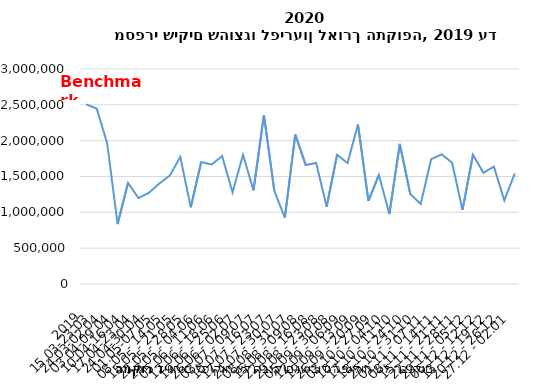
| Category | שקים שהוצגו |
|---|---|
| 2019 | 2505602.018 |
| 15.03-23.03 | 2447764.747 |
| 24.03-02.04 | 1969691.752 |
| 03.04-09.04 | 835909.958 |
| 10.04-16.04 | 1410844.055 |
| 17.04-23.04 | 1199728.1 |
| 24.04-30.04 | 1272102.004 |
| 01.05-07.05 | 1403450.125 |
| 08.05 - 14.05 | 1513602.584 |
| 15.05 - 21.05 | 1774359.916 |
| 22.05 - 28.05 | 1070139.033 |
| 29.05 - 04.06 | 1701196.476 |
| 05.06 - 11.06 | 1667047.789 |
| 12.06 - 18.06 | 1784783.333 |
| 19.06 - 25.06 | 1278883.621 |
| 26.06 - 02.07 | 1804113 |
| 03.07 - 09.07 | 1304956.889 |
| 10.07 - 16.07 | 2355105.692 |
| 17.07 - 23.07 | 1299211.824 |
| 24.07 - 30.07 | 927653.211 |
| 08.08 - 31.07 | 2085176.53 |
| 15.08 - 09.08 | 1659618.711 |
| 22.08 - 16.08 | 1689749.133 |
| 29.08 - 23.08 | 1078049.378 |
| 05.09 - 30.08 | 1803013.996 |
| 12.09 - 06.09 | 1687951.234 |
| 19.09 - 13.09 | 2224185.094 |
| 26.09 - 20.09 | 1160599.003 |
| 03.10 - 27.09 | 1523403.727 |
| 10.10 - 04.10 | 975678.408 |
| 17.10 - 11.10 | 1954541.579 |
| 18.10 - 24.10 | 1257682.014 |
| 25.10 - 31.10 | 1116123.876 |
| 01.11 - 07.11 | 1741536.639 |
| 08.11 - 14.11 | 1808615.341 |
| 15.11 - 21.11 | 1693507.541 |
| 22.11 - 28.11 | 1033918.1 |
| 29.11 - 05.12 | 1803399.609 |
| 06.12 - 12.12 | 1551004.828 |
| 13.12 - 19.12 | 1639094.026 |
| 20.12 - 26.12 | 1166236.007 |
| 27.12 - 02.01 | 1542105.169 |